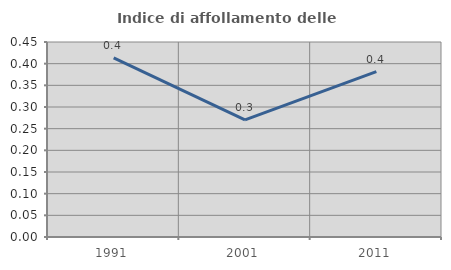
| Category | Indice di affollamento delle abitazioni  |
|---|---|
| 1991.0 | 0.414 |
| 2001.0 | 0.27 |
| 2011.0 | 0.382 |